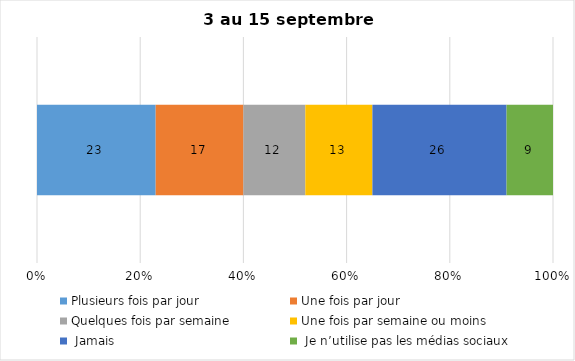
| Category | Plusieurs fois par jour | Une fois par jour | Quelques fois par semaine   | Une fois par semaine ou moins   |  Jamais   |  Je n’utilise pas les médias sociaux |
|---|---|---|---|---|---|---|
| 0 | 23 | 17 | 12 | 13 | 26 | 9 |